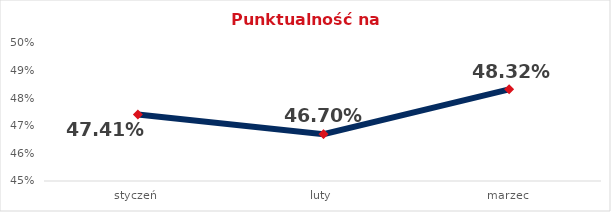
| Category | Series 0 |
|---|---|
| styczeń | 0.474 |
| luty | 0.467 |
| marzec | 0.483 |